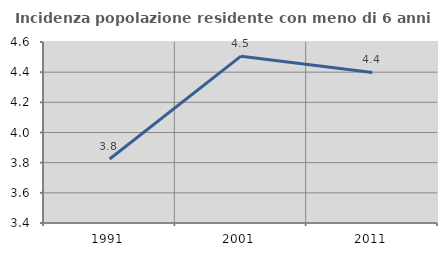
| Category | Incidenza popolazione residente con meno di 6 anni |
|---|---|
| 1991.0 | 3.825 |
| 2001.0 | 4.506 |
| 2011.0 | 4.398 |